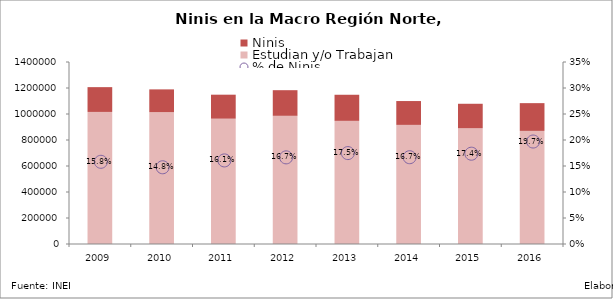
| Category | Estudian y/o Trabajan | Ninis |
|---|---|---|
| 2009.0 | 1015876.81 | 190740 |
| 2010.0 | 1013849.3 | 175507.54 |
| 2011.0 | 963940.33 | 184597.3 |
| 2012.0 | 986047.7 | 197121.12 |
| 2013.0 | 947293.83 | 200712.39 |
| 2014.0 | 916141.55 | 183545.03 |
| 2015.0 | 891373.49 | 187326.03 |
| 2016.0 | 870022.75 | 213518.71 |